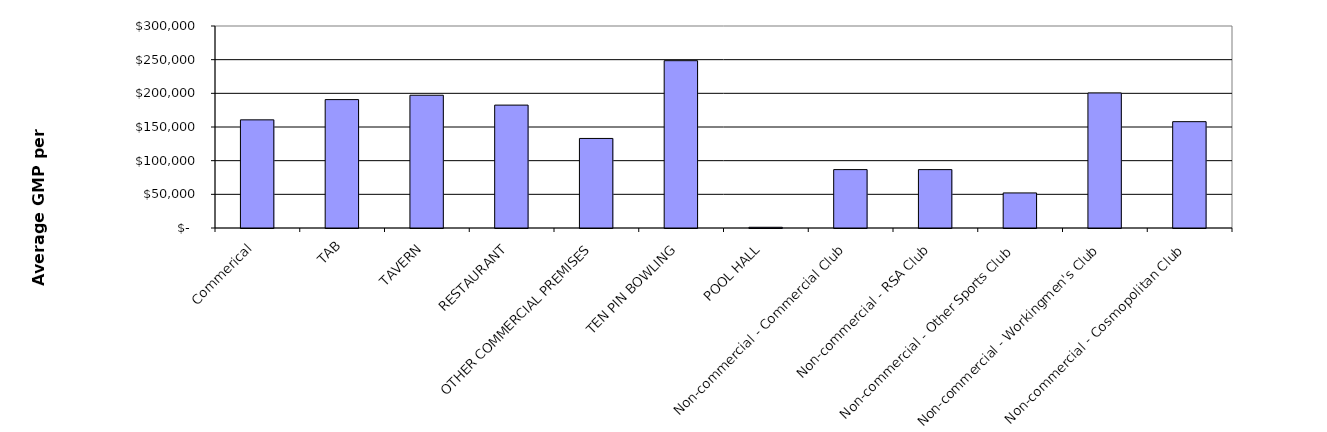
| Category | Series 0 |
|---|---|
| Commerical | 160609.378 |
| TAB | 190695.464 |
| TAVERN | 197191.858 |
| RESTAURANT | 182530.109 |
| OTHER COMMERCIAL PREMISES | 132994.16 |
| TEN PIN BOWLING | 248488.639 |
| POOL HALL | 1078.405 |
| Non-commercial - Commercial Club | 86740.346 |
| Non-commercial - RSA Club | 86696.914 |
| Non-commercial - Other Sports Club | 52080.158 |
| Non-commercial - Workingmen's Club | 200573.531 |
| Non-commercial - Cosmopolitan Club | 157919.982 |